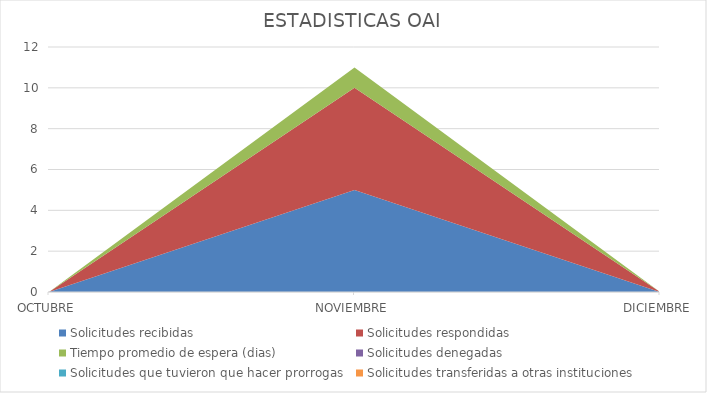
| Category | Solicitudes recibidas | Solicitudes respondidas | Tiempo promedio de espera (dias) | Solicitudes denegadas | Solicitudes que tuvieron que hacer prorrogas  | Solicitudes transferidas a otras instituciones  |
|---|---|---|---|---|---|---|
| OCTUBRE | 0 | 0 | 0 | 0 | 0 | 0 |
| NOVIEMBRE | 5 | 5 | 1 | 0 | 0 | 0 |
| DICIEMBRE | 0 | 0 | 0 | 0 | 0 | 0 |